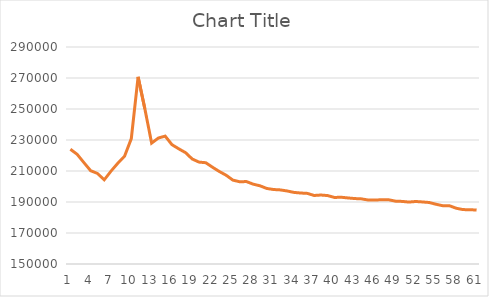
| Category | Series 0 |
|---|---|
| 0 | 223985.074 |
| 1 | 220816.005 |
| 2 | 215399.918 |
| 3 | 210214.37 |
| 4 | 208424.432 |
| 5 | 204297.434 |
| 6 | 209927.394 |
| 7 | 215010.515 |
| 8 | 219504.238 |
| 9 | 230944.512 |
| 10 | 270761.09 |
| 11 | 250095.752 |
| 12 | 227997.253 |
| 13 | 231271.88 |
| 14 | 232511.525 |
| 15 | 227002.891 |
| 16 | 224328.11 |
| 17 | 221861.65 |
| 18 | 217719.009 |
| 19 | 215737.926 |
| 20 | 215343.632 |
| 21 | 212402.889 |
| 22 | 209674.725 |
| 23 | 207281.276 |
| 24 | 204118.081 |
| 25 | 203066.652 |
| 26 | 203184.903 |
| 27 | 201504.942 |
| 28 | 200459.15 |
| 29 | 198751.71 |
| 30 | 198054.338 |
| 31 | 197805.143 |
| 32 | 197135.115 |
| 33 | 196203.624 |
| 34 | 195797.51 |
| 35 | 195556.008 |
| 36 | 194207.979 |
| 37 | 194499.82 |
| 38 | 194149.322 |
| 39 | 192930.587 |
| 40 | 193066.745 |
| 41 | 192620.694 |
| 42 | 192223.497 |
| 43 | 192013.012 |
| 44 | 191263.429 |
| 45 | 191214.333 |
| 46 | 191524.106 |
| 47 | 191432.498 |
| 48 | 190557.454 |
| 49 | 190382.073 |
| 50 | 189955.732 |
| 51 | 190330.973 |
| 52 | 190036.234 |
| 53 | 189675.763 |
| 54 | 188543.256 |
| 55 | 187599.334 |
| 56 | 187573.072 |
| 57 | 185951.765 |
| 58 | 185102.265 |
| 59 | 185003.7 |
| 60 | 184831.445 |